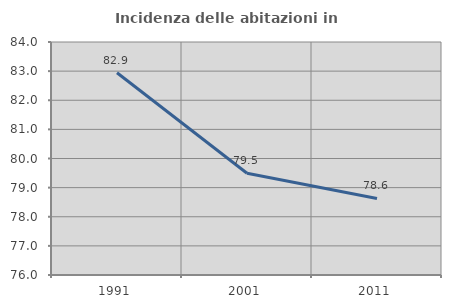
| Category | Incidenza delle abitazioni in proprietà  |
|---|---|
| 1991.0 | 82.944 |
| 2001.0 | 79.494 |
| 2011.0 | 78.628 |